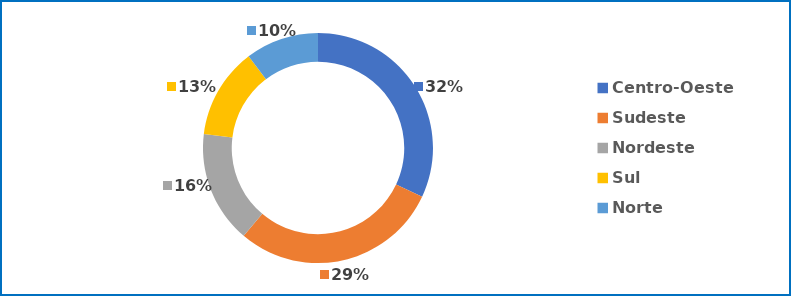
| Category | Percentual |
|---|---|
| Centro-Oeste | 0.316 |
| Sudeste | 0.289 |
| Nordeste | 0.156 |
| Sul | 0.126 |
| Norte | 0.102 |